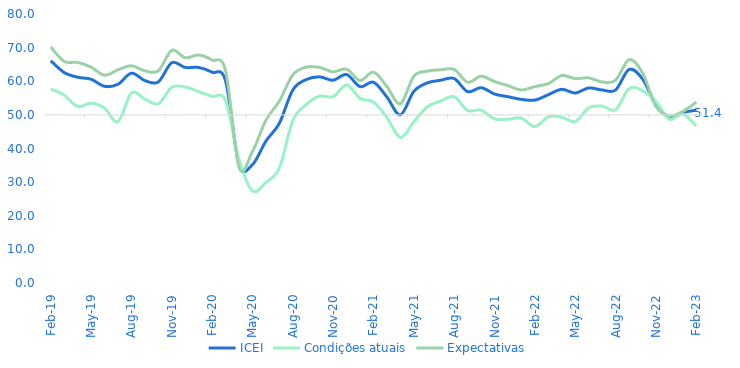
| Category | ICEI | Condições atuais | Expectativas |
|---|---|---|---|
| 2019-02-01 | 66.1 | 57.7 | 70.2 |
| 2019-03-01 | 62.6 | 55.9 | 65.9 |
| 2019-04-01 | 61.2 | 52.5 | 65.6 |
| 2019-05-01 | 60.6 | 53.5 | 64.2 |
| 2019-06-01 | 58.5 | 52 | 61.8 |
| 2019-07-01 | 59.1 | 48 | 63.4 |
| 2019-08-01 | 62.4 | 56.5 | 64.6 |
| 2019-09-01 | 60.2 | 54.7 | 63.1 |
| 2019-10-01 | 59.8 | 53.3 | 63.1 |
| 2019-11-01 | 65.5 | 58.2 | 69.2 |
| 2019-12-01 | 64.1 | 58.3 | 67 |
| 2020-01-01 | 64.1 | 56.9 | 67.8 |
| 2020-02-01 | 62.7 | 55.5 | 66.3 |
| 2020-03-01 | 60.1 | 54.2 | 63.1 |
| 2020-04-01 | 35.2 | 36.8 | 34.4 |
| 2020-05-01 | 35.2 | 27.4 | 39.1 |
| 2020-06-01 | 42.2 | 29.9 | 48.4 |
| 2020-07-01 | 47.5 | 34.2 | 54.1 |
| 2020-08-01 | 57.4 | 48.3 | 61.9 |
| 2020-09-01 | 60.5 | 53.1 | 64.2 |
| 2020-10-01 | 61.3 | 55.6 | 64.1 |
| 2020-11-01 | 60.3 | 55.4 | 62.8 |
| 2020-12-01 | 62 | 58.9 | 63.6 |
| 2021-01-01 | 58.4 | 54.9 | 60.2 |
| 2021-02-01 | 59.7 | 53.8 | 62.7 |
| 2021-03-01 | 55.3 | 49.2 | 58.4 |
| 2021-04-01 | 50 | 43.3 | 53.3 |
| 2021-05-01 | 57 | 47.9 | 61.5 |
| 2021-06-01 | 59.5 | 52.4 | 63 |
| 2021-07-01 | 60.3 | 54.1 | 63.4 |
| 2021-08-01 | 60.8 | 55.4 | 63.5 |
| 2021-09-01 | 56.9 | 51.3 | 59.7 |
| 2021-10-01 | 58.1 | 51.4 | 61.5 |
| 2021-11-01 | 56.2 | 48.8 | 59.9 |
| 2021-12-01 | 55.4 | 48.7 | 58.7 |
| 2022-01-01 | 54.6 | 49 | 57.4 |
| 2022-02-01 | 54.4 | 46.5 | 58.4 |
| 2022-03-01 | 56 | 49.4 | 59.3 |
| 2022-04-01 | 57.6 | 49.3 | 61.7 |
| 2022-05-01 | 56.5 | 48 | 60.8 |
| 2022-06-01 | 58 | 52.1 | 61 |
| 2022-07-01 | 57.4 | 52.6 | 59.8 |
| 2022-08-01 | 57.4 | 51.5 | 60.3 |
| 2022-09-01 | 63.5 | 57.8 | 66.4 |
| 2022-10-01 | 60.7 | 57.2 | 62.5 |
| 2022-11-01 | 53 | 54 | 52.5 |
| 2022-12-01 | 49.4 | 48.7 | 49.7 |
| 2023-01-01 | 50.7 | 50.2 | 51 |
| 2023-02-01 | 51.4 | 46.7 | 53.8 |